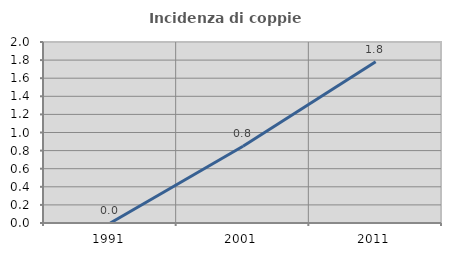
| Category | Incidenza di coppie miste |
|---|---|
| 1991.0 | 0 |
| 2001.0 | 0.849 |
| 2011.0 | 1.781 |